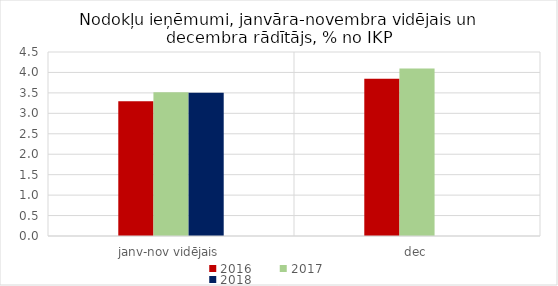
| Category | 2016 | 2017 | 2018 |
|---|---|---|---|
| janv-nov vidējais | 3.293 | 3.514 | 3.505 |
| dec | 3.846 | 4.096 | 0 |